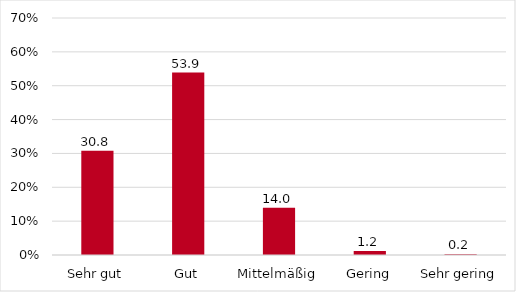
| Category | Series 0 |
|---|---|
| Sehr gut | 30.814 |
| Gut | 53.876 |
| Mittelmäßig | 13.953 |
| Gering | 1.163 |
| Sehr gering | 0.194 |